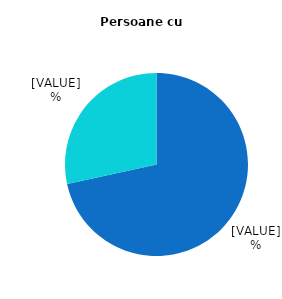
| Category | Persoane        cu       dizabilități |
|---|---|
| Salariat | 71.6 |
| Non-salariat | 28.4 |